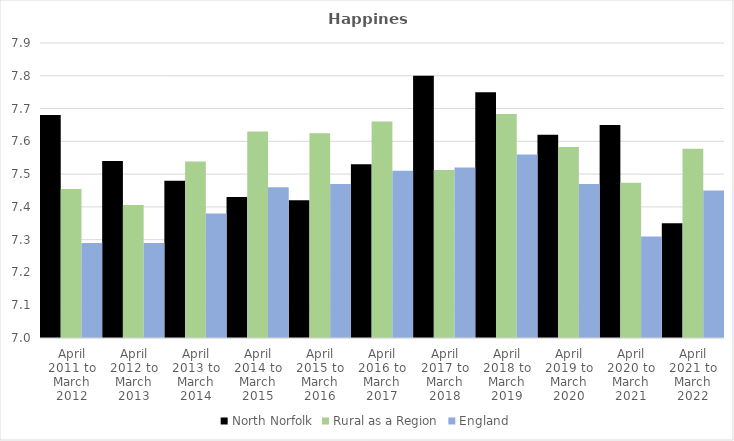
| Category | North Norfolk | Rural as a Region | England |
|---|---|---|---|
| April 2011 to March 2012 | 7.68 | 7.454 | 7.29 |
| April 2012 to March 2013 | 7.54 | 7.406 | 7.29 |
| April 2013 to March 2014 | 7.48 | 7.539 | 7.38 |
| April 2014 to March 2015 | 7.43 | 7.63 | 7.46 |
| April 2015 to March 2016 | 7.42 | 7.625 | 7.47 |
| April 2016 to March 2017 | 7.53 | 7.661 | 7.51 |
| April 2017 to March 2018 | 7.8 | 7.513 | 7.52 |
| April 2018 to March 2019 | 7.75 | 7.684 | 7.56 |
| April 2019 to March 2020 | 7.62 | 7.582 | 7.47 |
| April 2020 to March 2021 | 7.65 | 7.474 | 7.31 |
| April 2021 to March 2022 | 7.35 | 7.577 | 7.45 |